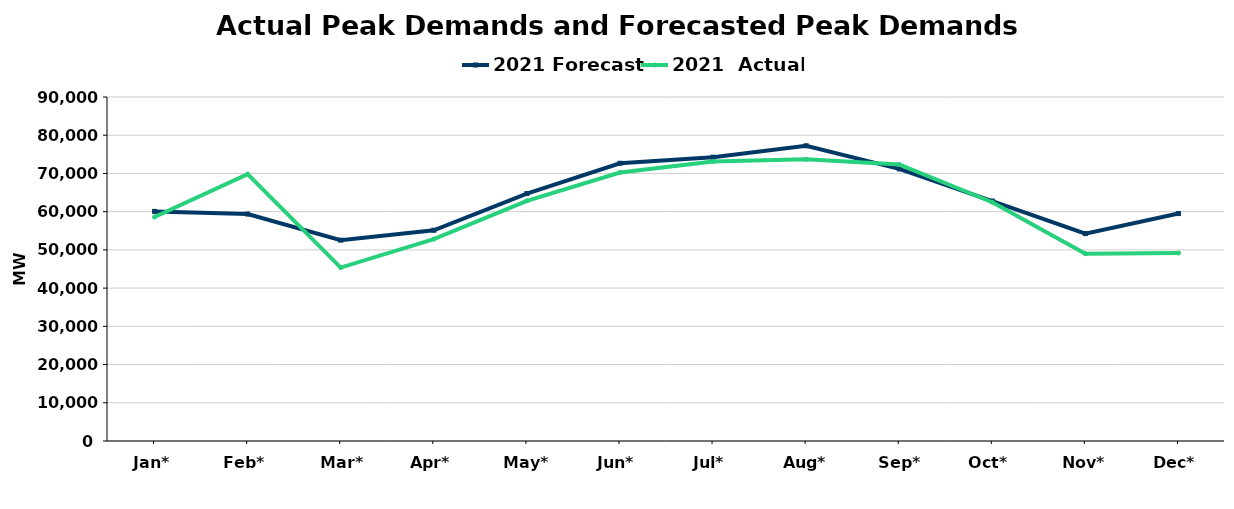
| Category | 2021 Forecast | 2021  Actual |
|---|---|---|
| Jan* | 60074 | 58606 |
| Feb* | 59380 | 69812 |
| Mar* | 52541 | 45380 |
| Apr* | 55139 | 52814 |
| May* | 64742 | 62832 |
| Jun* | 72662 | 70257 |
| Jul* | 74253 | 73145 |
| Aug* | 77244 | 73687 |
| Sep* | 71201 | 72370 |
| Oct* | 62782 | 62476 |
| Nov* | 54261 | 48983 |
| Dec* | 59500 | 49192 |